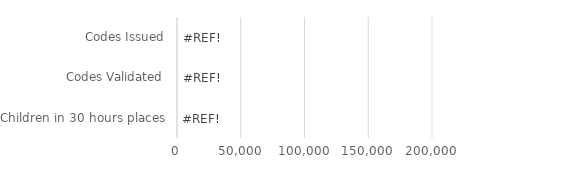
| Category | Series 0 |
|---|---|
| Children in 30 hours places | 0 |
| Codes Validated | 0 |
| Codes Issued | 0 |